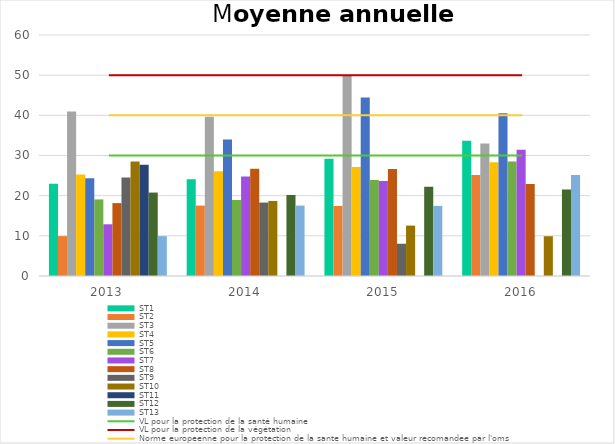
| Category | ST1 | ST2 | ST3 | ST4 | ST5 | ST6 | ST7 | ST8 | ST9 | ST10 | ST11 | ST12 | ST13 |
|---|---|---|---|---|---|---|---|---|---|---|---|---|---|
| 2013.0 | 22.961 | 9.929 | 40.967 | 25.257 | 24.347 | 19.068 | 12.873 | 18.145 | 24.54 | 28.478 | 27.722 | 20.77 | 9.929 |
| 2014.0 | 24.109 | 17.533 | 39.661 | 26.1 | 34.008 | 18.92 | 24.77 | 26.69 | 18.281 | 18.686 | 0 | 20.177 | 17.533 |
| 2015.0 | 29.174 | 17.445 | 49.859 | 27.109 | 44.431 | 23.907 | 23.651 | 26.609 | 8.034 | 12.549 | 0 | 22.204 | 17.445 |
| 2016.0 | 33.647 | 25.161 | 32.958 | 28.318 | 40.49 | 28.525 | 31.458 | 22.9 | 0 | 9.899 | 0 | 21.544 | 25.161 |